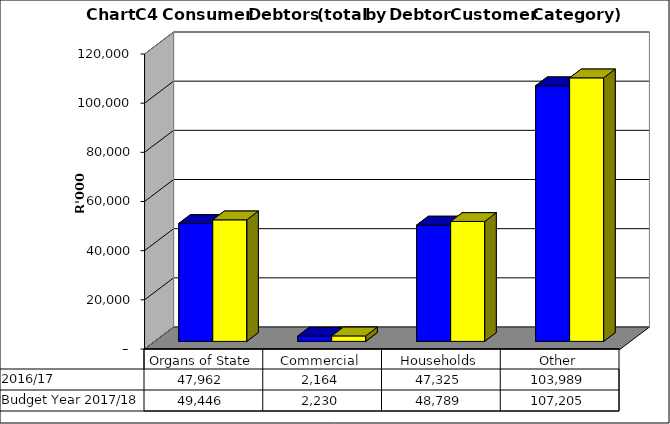
| Category |  2016/17  | Budget Year 2017/18 |
|---|---|---|
| Organs of State | 47962300.676 | 49445670.8 |
| Commercial | 2163574.873 | 2230489.56 |
| Households | 47325489.051 | 48789163.97 |
| Other | 103988721.116 | 107204867.13 |